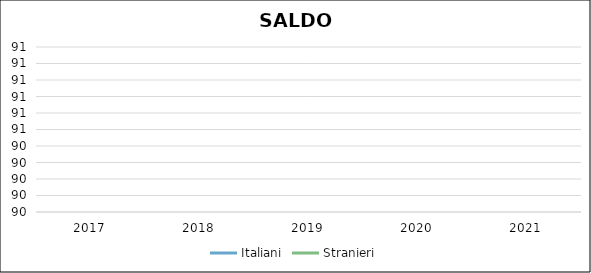
| Category | Italiani | Stranieri | Series 2 | Series 3 |
|---|---|---|---|---|
| 2017.0 | 0 | 0 |  |  |
| 2018.0 | 0 | 0 |  |  |
| 2019.0 | 0 | 0 |  |  |
| 2020.0 | 0 | 0 |  |  |
| 2021.0 | 0 | 0 |  |  |